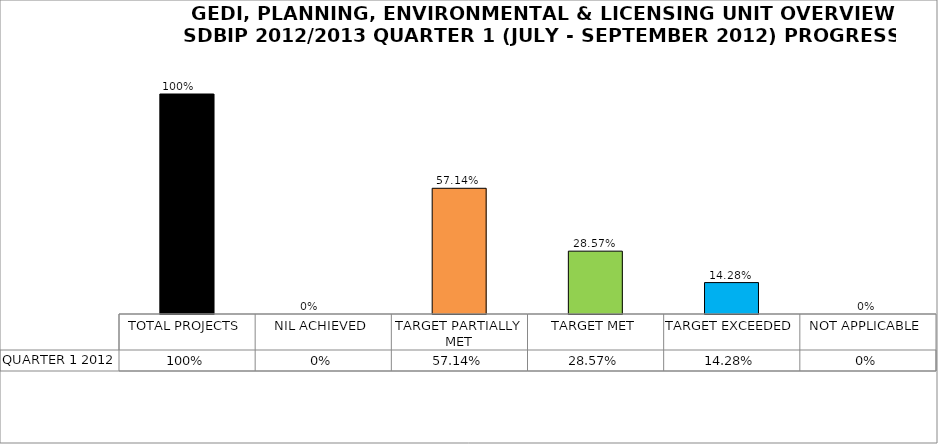
| Category | QUARTER 1 2012 |
|---|---|
| TOTAL PROJECTS | 1 |
| NIL ACHIEVED | 0 |
| TARGET PARTIALLY MET | 0.571 |
| TARGET MET | 0.286 |
| TARGET EXCEEDED | 0.143 |
| NOT APPLICABLE | 0 |